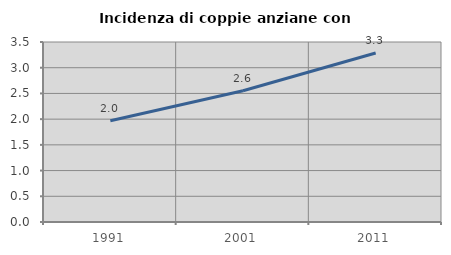
| Category | Incidenza di coppie anziane con figli |
|---|---|
| 1991.0 | 1.969 |
| 2001.0 | 2.551 |
| 2011.0 | 3.286 |